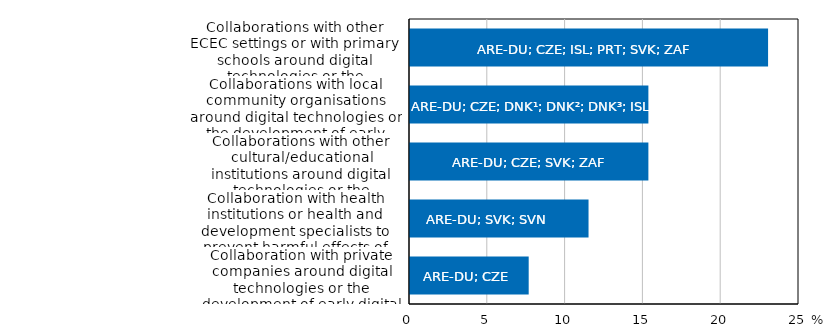
| Category | Percentage of countries |
|---|---|
| Collaboration with private companies around digital technologies or the development of early digital literacy | 7.692 |
| Collaboration with health institutions or health and development specialists to prevent harmful effects of digital technologies for young children | 11.538 |
| Collaborations with other cultural/educational institutions around digital technologies or the development of early digital literacy | 15.385 |
| Collaborations with local community organisations around digital technologies or the development of early digital literacy | 15.385 |
| Collaborations with other ECEC settings or with primary schools around digital technologies or the development of digital literacy | 23.077 |